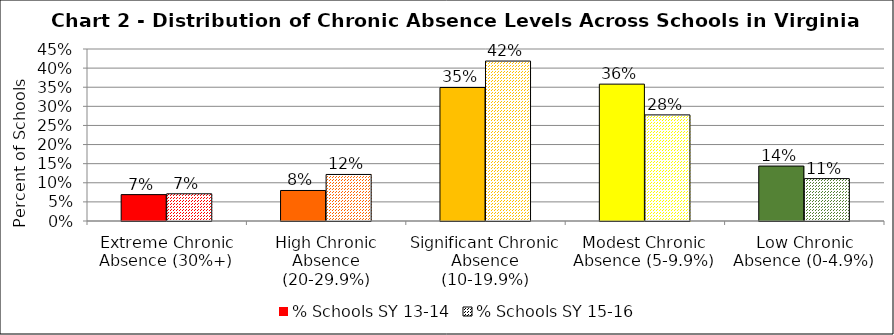
| Category | % Schools SY 13-14 | % Schools SY 15-16 |
|---|---|---|
| Extreme Chronic Absence (30%+) | 0.069 | 0.071 |
| High Chronic Absence (20-29.9%) | 0.08 | 0.122 |
| Significant Chronic Absence (10-19.9%) | 0.349 | 0.418 |
| Modest Chronic Absence (5-9.9%) | 0.358 | 0.278 |
| Low Chronic Absence (0-4.9%) | 0.144 | 0.111 |